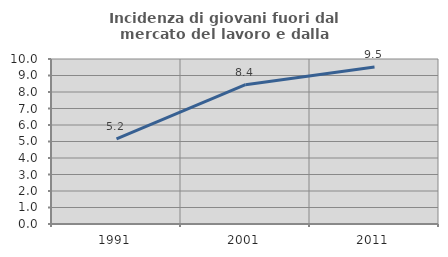
| Category | Incidenza di giovani fuori dal mercato del lavoro e dalla formazione  |
|---|---|
| 1991.0 | 5.158 |
| 2001.0 | 8.442 |
| 2011.0 | 9.512 |